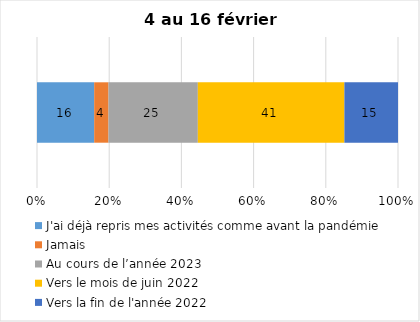
| Category | J'ai déjà repris mes activités comme avant la pandémie | Jamais | Au cours de l’année 2023 | Vers le mois de juin 2022 | Vers la fin de l'année 2022 |
|---|---|---|---|---|---|
| 0 | 16 | 4 | 25 | 41 | 15 |